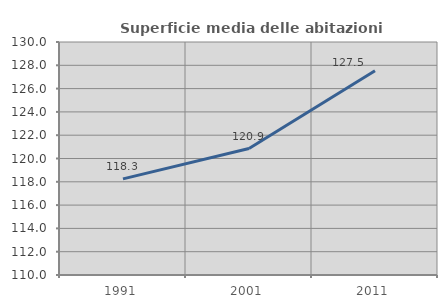
| Category | Superficie media delle abitazioni occupate |
|---|---|
| 1991.0 | 118.251 |
| 2001.0 | 120.858 |
| 2011.0 | 127.532 |